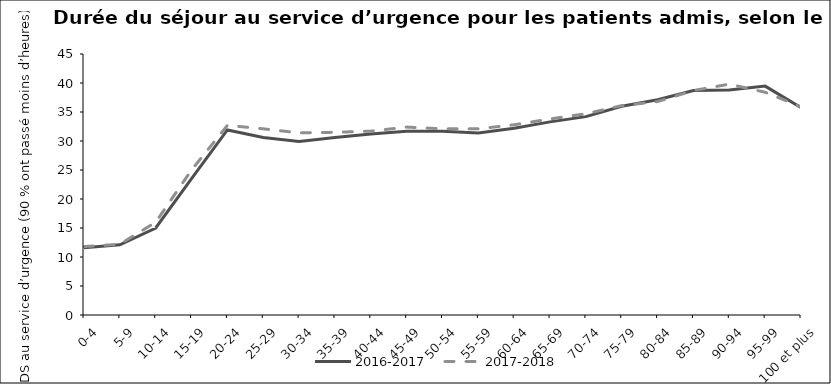
| Category | 2016-2017 | 2017-2018 |
|---|---|---|
| 0-4 | 11.6 | 11.8 |
| 5-9 | 12.1 | 12.2 |
| 10-14 | 15 | 16 |
| 15-19 | 23.5 | 25 |
| 20-24 | 31.9 | 32.7 |
| 25-29 | 30.6 | 32.1 |
| 30-34 | 29.9 | 31.4 |
| 35-39 | 30.6 | 31.5 |
| 40-44 | 31.2 | 31.7 |
| 45-49 | 31.7 | 32.4 |
| 50-54 | 31.7 | 32.1 |
| 55-59 | 31.4 | 32.1 |
| 60-64 | 32.2 | 32.8 |
| 65-69 | 33.3 | 33.8 |
| 70-74 | 34.2 | 34.7 |
| 75-79 | 36 | 36.1 |
| 80-84 | 37.1 | 36.8 |
| 85-89 | 38.7 | 38.7 |
| 90-94 | 38.8 | 39.8 |
| 95-99 | 39.46 | 38.4 |
| 100 et plus | 35.77 | 35.9 |